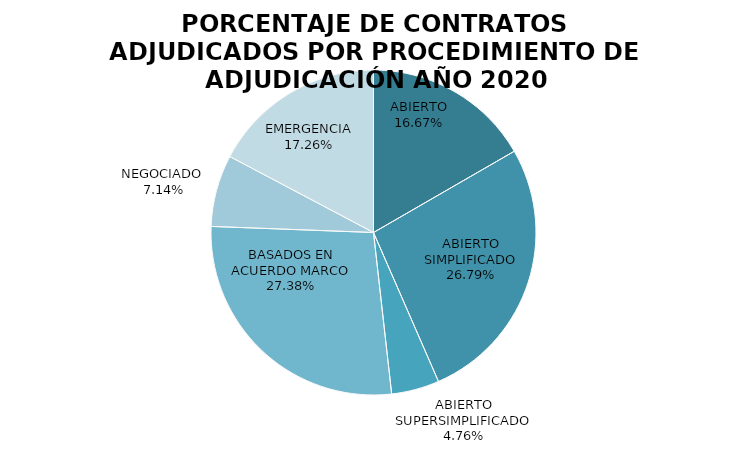
| Category | CONTRATOS ADJUDICADOS POR PROCEDIMIENTO DE ADJUDICACIÓN
AÑO 2020 VALOR | CONTRATOS ADJUDICADOS POR PROCEDIMIENTO DE ADJUDICACIÓN
AÑO 2020 % |
|---|---|---|
| ABIERTO | 28 | 16.667 |
| ABIERTO SIMPLIFICADO | 45 | 26.786 |
| ABIERTO SUPERSIMPLIFICADO | 8 | 4.762 |
| BASADOS EN ACUERDO MARCO | 46 | 27.381 |
| NEGOCIADO  | 12 | 7.143 |
| EMERGENCIA | 29 | 17.262 |